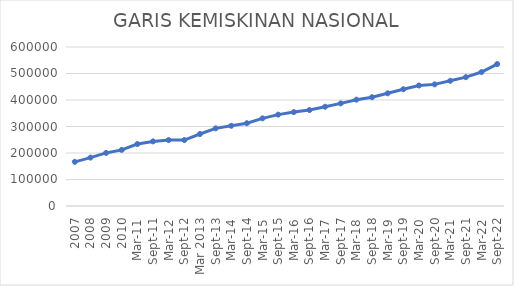
| Category | GARIS KEMISKINAN NASIONAL |
|---|---|
| 2007 | 166697 |
| 2008 | 182636 |
| 2009 | 200262 |
| 2010 | 211726 |
| Mar-11 | 233740 |
| Sep-11 | 243729 |
| Mar-12 | 248707 |
| Sep-12 | 248707 |
| Mar 2013 | 271626 |
| Sep-13 | 292951 |
| Mar-14 | 302735 |
| Sep-14 | 312328 |
| Mar-15 | 330776 |
| Sep-15 | 344809 |
| Mar-16 | 354386 |
| Sep-16 | 361990 |
| Mar-17 | 374478 |
| Sep-17 | 387160 |
| Mar-18 | 401220 |
| Sep-18 | 410670 |
| Mar-19 | 425250 |
| Sep-19 | 440538 |
| Mar-20 | 454652 |
| Sep-20 | 458947 |
| Mar-21 | 472515 |
| Sep-21 | 486168 |
| Mar-22 | 505469 |
| Sep-22 | 535547 |